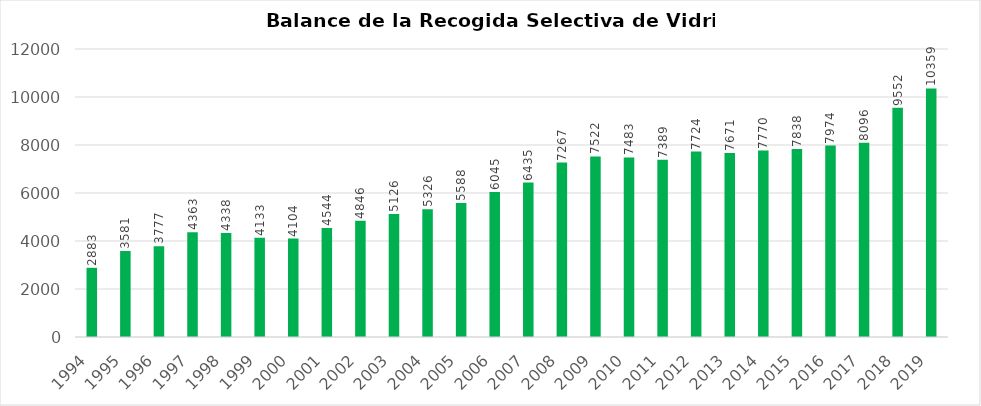
| Category | Series 0 |
|---|---|
| 1994.0 | 2883 |
| 1995.0 | 3581 |
| 1996.0 | 3777 |
| 1997.0 | 4363 |
| 1998.0 | 4338 |
| 1999.0 | 4133 |
| 2000.0 | 4104 |
| 2001.0 | 4544 |
| 2002.0 | 4846 |
| 2003.0 | 5126 |
| 2004.0 | 5326 |
| 2005.0 | 5588 |
| 2006.0 | 6045 |
| 2007.0 | 6435 |
| 2008.0 | 7267 |
| 2009.0 | 7522 |
| 2010.0 | 7483 |
| 2011.0 | 7389 |
| 2012.0 | 7724 |
| 2013.0 | 7671 |
| 2014.0 | 7770 |
| 2015.0 | 7838 |
| 2016.0 | 7974 |
| 2017.0 | 8096 |
| 2018.0 | 9552 |
| 2019.0 | 10359 |